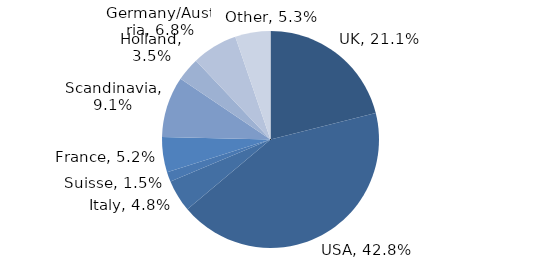
| Category | Investment Style |
|---|---|
| UK | 0.211 |
| USA | 0.428 |
| Italy | 0.048 |
| Suisse | 0.015 |
| France | 0.052 |
| Scandinavia | 0.091 |
| Holland | 0.035 |
| Germany/Austria | 0.068 |
| Other | 0.053 |